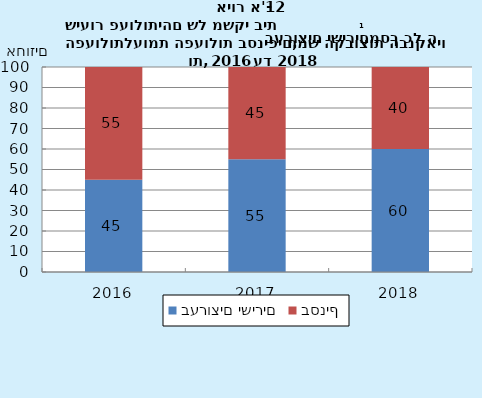
| Category | בערוצים ישירים | בסניף |
|---|---|---|
| 2016.0 | 45 | 55 |
| 2017.0 | 55 | 45 |
| 2018.0 | 60 | 40 |